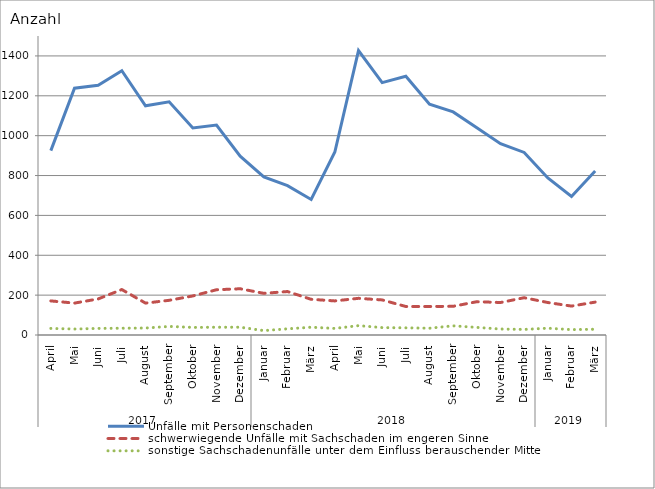
| Category | Unfälle mit Personenschaden | schwerwiegende Unfälle mit Sachschaden im engeren Sinne | sonstige Sachschadenunfälle unter dem Einfluss berauschender Mittel |
|---|---|---|---|
| 0 | 925 | 171 | 33 |
| 1 | 1238 | 160 | 30 |
| 2 | 1253 | 181 | 33 |
| 3 | 1326 | 228 | 34 |
| 4 | 1150 | 160 | 35 |
| 5 | 1170 | 174 | 43 |
| 6 | 1039 | 196 | 38 |
| 7 | 1053 | 227 | 39 |
| 8 | 897 | 232 | 39 |
| 9 | 793 | 209 | 22 |
| 10 | 749 | 218 | 31 |
| 11 | 680 | 179 | 39 |
| 12 | 918 | 171 | 33 |
| 13 | 1427 | 184 | 47 |
| 14 | 1266 | 176 | 37 |
| 15 | 1298 | 143 | 36 |
| 16 | 1158 | 143 | 34 |
| 17 | 1119 | 144 | 46 |
| 18 | 1040 | 167 | 38 |
| 19 | 960 | 163 | 30 |
| 20 | 916 | 187 | 28 |
| 21 | 788 | 163 | 34 |
| 22 | 695 | 145 | 27 |
| 23 | 823 | 165 | 29 |